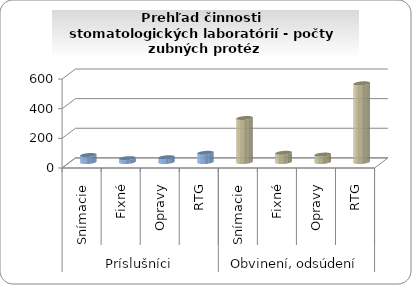
| Category | Series 0 |
|---|---|
| 0 | 47 |
| 1 | 26 |
| 2 | 32 |
| 3 | 62 |
| 4 | 297 |
| 5 | 62 |
| 6 | 50 |
| 7 | 531 |